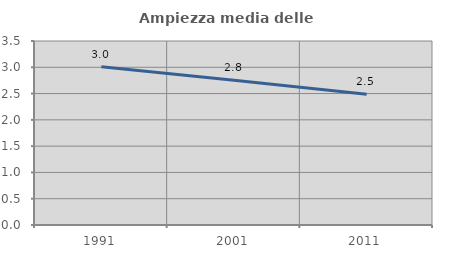
| Category | Ampiezza media delle famiglie |
|---|---|
| 1991.0 | 3.012 |
| 2001.0 | 2.751 |
| 2011.0 | 2.488 |